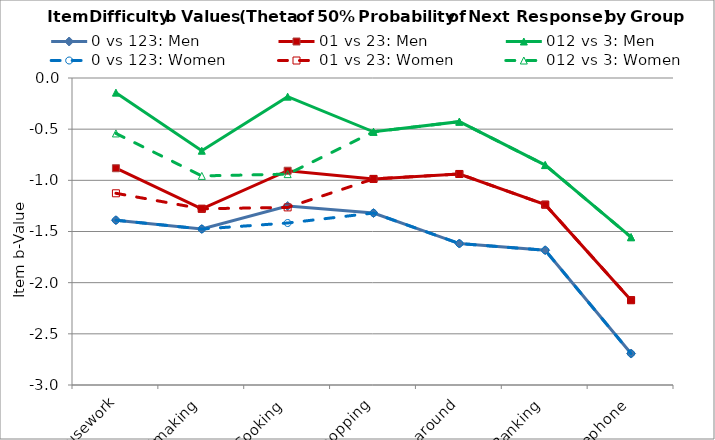
| Category | 0 vs 123: Men | 01 vs 23: Men | 012 vs 3: Men | 0 vs 123: Women | 01 vs 23: Women | 012 vs 3: Women |
|---|---|---|---|---|---|---|
| 1. Housework | -1.389 | -0.882 | -0.143 | -1.389 | -1.127 | -0.542 |
| 2. Bedmaking | -1.476 | -1.278 | -0.711 | -1.476 | -1.278 | -0.957 |
| 3. Cooking | -1.251 | -0.906 | -0.182 | -1.417 | -1.264 | -0.939 |
| 4. Shopping | -1.32 | -0.986 | -0.526 | -1.32 | -0.986 | -0.526 |
| 5. Getting around | -1.618 | -0.938 | -0.427 | -1.618 | -0.938 | -0.427 |
| 6. Banking | -1.683 | -1.237 | -0.851 | -1.683 | -1.237 | -0.851 |
| 7. Telephone | -2.693 | -2.171 | -1.556 | -2.693 | -2.171 | -1.556 |